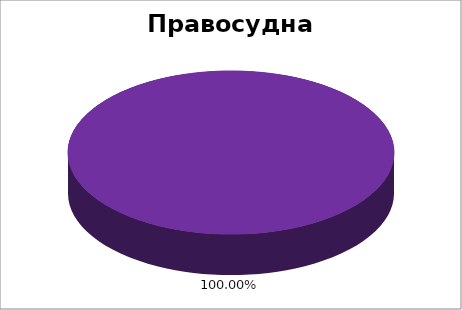
| Category | Правосудна академија  |
|---|---|
| 0 | 1 |
| 1 | 0 |
| 2 | 0 |
| 3 | 0 |
| 4 | 0 |